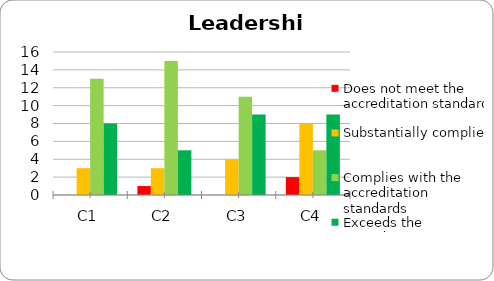
| Category | Does not meet the accreditation standard | Substantially complies | Complies with the accreditation standards | Exceeds the accreditation standards |
|---|---|---|---|---|
| C1 | 0 | 3 | 13 | 8 |
| C2 | 1 | 3 | 15 | 5 |
| C3 | 0 | 4 | 11 | 9 |
| C4 | 2 | 8 | 5 | 9 |